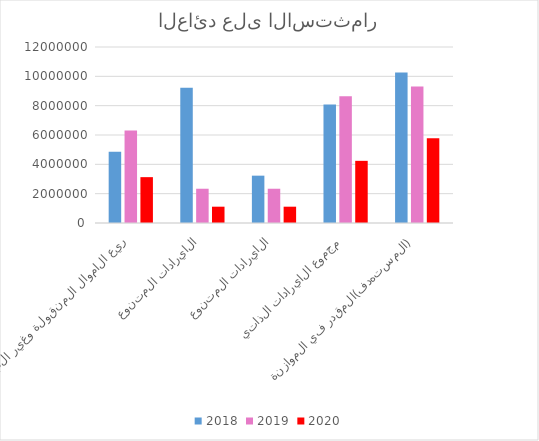
| Category | 2018 | 2019 | 2020 |
|---|---|---|---|
| ريع الاموال المنقولة وغير المنقولة | 4850401 | 6309844 | 3126182 |
| الايرادات المتنوعة | 9227535 | 2336208 | 1112020 |
| الايرادات المتنوعة | 3227535 | 2336208 | 1112020 |
| مجموع الايرادات الذاتية | 8077936 | 8646052 | 4238202 |
| المستهدف(المقدر في الموازنة) | 10263000 | 9300000 | 5780000 |